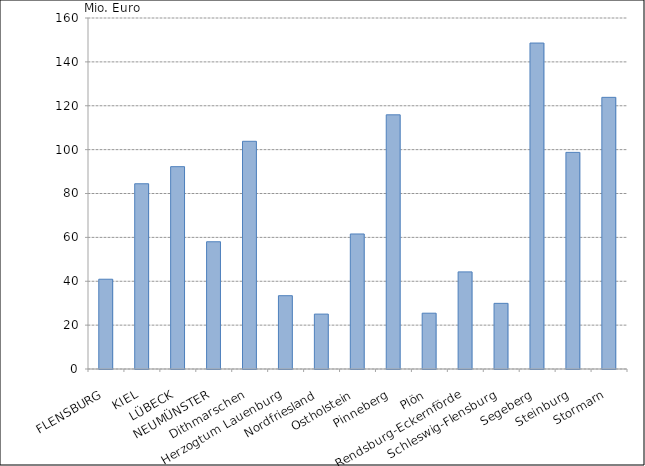
| Category | Series 0 |
|---|---|
| FLENSBURG | 40921.17 |
| KIEL | 84442.376 |
| LÜBECK | 92233.406 |
| NEUMÜNSTER | 57999.979 |
| Dithmarschen | 103801.852 |
| Herzogtum Lauenburg | 33416.178 |
| Nordfriesland | 25022.614 |
| Ostholstein | 61545.73 |
| Pinneberg | 115863.307 |
| Plön | 25434.779 |
| Rendsburg-Eckernförde | 44271.528 |
| Schleswig-Flensburg | 29921.784 |
| Segeberg | 148582.649 |
| Steinburg | 98743.219 |
| Stormarn | 123826.598 |